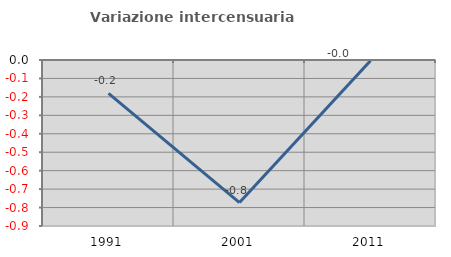
| Category | Variazione intercensuaria annua |
|---|---|
| 1991.0 | -0.181 |
| 2001.0 | -0.773 |
| 2011.0 | -0.004 |